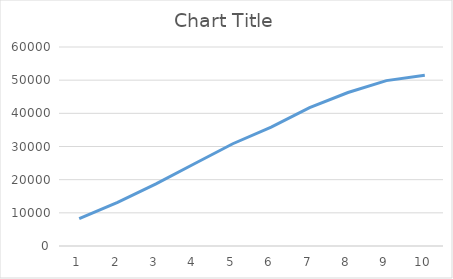
| Category | Series 0 |
|---|---|
| 0 | 8253 |
| 1 | 13183 |
| 2 | 18730 |
| 3 | 24790 |
| 4 | 30835 |
| 5 | 35831 |
| 6 | 41719 |
| 7 | 46271 |
| 8 | 49859 |
| 9 | 51449 |